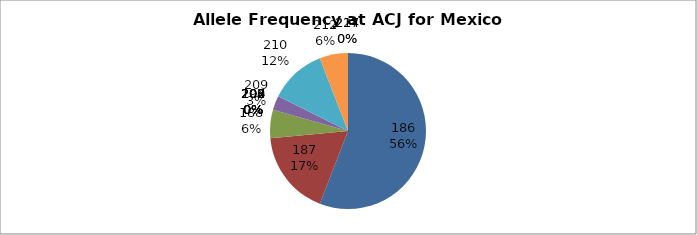
| Category | Series 0 |
|---|---|
| 186.0 | 0.559 |
| 187.0 | 0.176 |
| 188.0 | 0.059 |
| 190.0 | 0 |
| 202.0 | 0 |
| 204.0 | 0 |
| 206.0 | 0 |
| 207.0 | 0 |
| 208.0 | 0 |
| 209.0 | 0.029 |
| 210.0 | 0.118 |
| 212.0 | 0.059 |
| 214.0 | 0 |
| 227.0 | 0 |